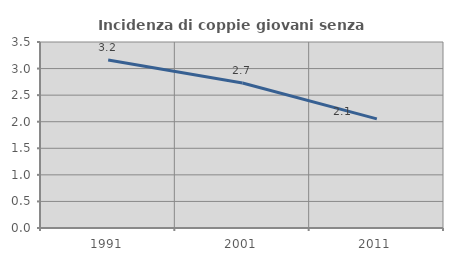
| Category | Incidenza di coppie giovani senza figli |
|---|---|
| 1991.0 | 3.161 |
| 2001.0 | 2.727 |
| 2011.0 | 2.053 |